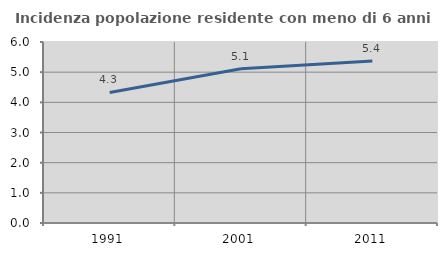
| Category | Incidenza popolazione residente con meno di 6 anni |
|---|---|
| 1991.0 | 4.329 |
| 2001.0 | 5.116 |
| 2011.0 | 5.369 |